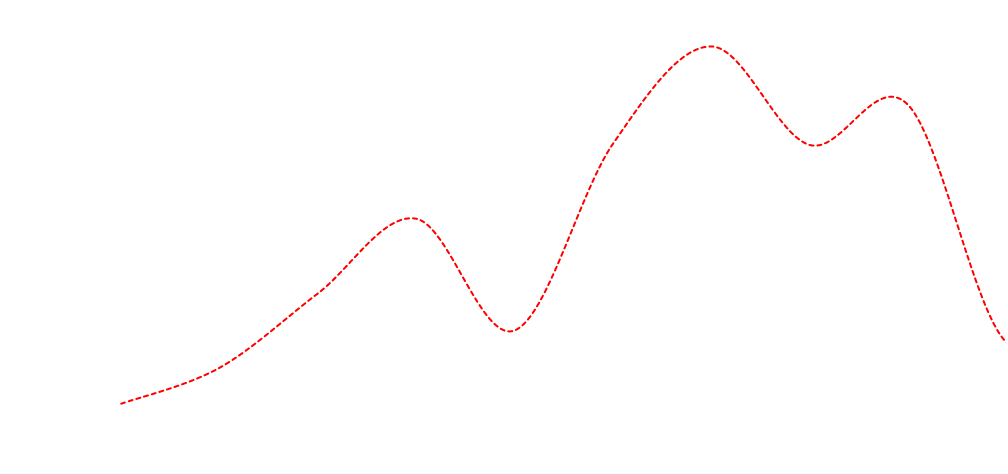
| Category | Series 0 |
|---|---|
| 0 | 23058.028 |
| 1 | 23427.196 |
| 2 | 24190.871 |
| 3 | 24958.18 |
| 4 | 23810.03 |
| 5 | 25725.35 |
| 6 | 26728.366 |
| 7 | 25717.124 |
| 8 | 26131.595 |
| 9 | 23691.971 |
| 10 | 24091.463 |